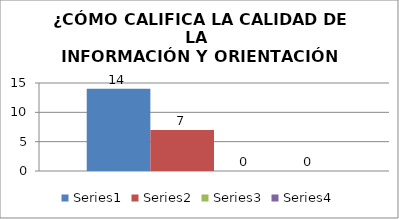
| Category | Series 0 | Series 1 | Series 2 | Series 3 |
|---|---|---|---|---|
| 0 | 14 | 7 | 0 | 0 |